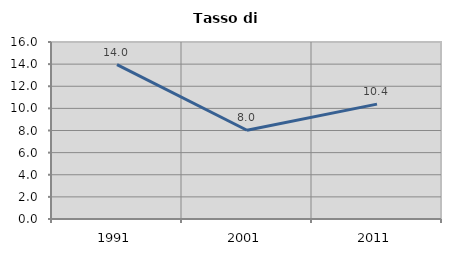
| Category | Tasso di disoccupazione   |
|---|---|
| 1991.0 | 13.956 |
| 2001.0 | 8.02 |
| 2011.0 | 10.386 |